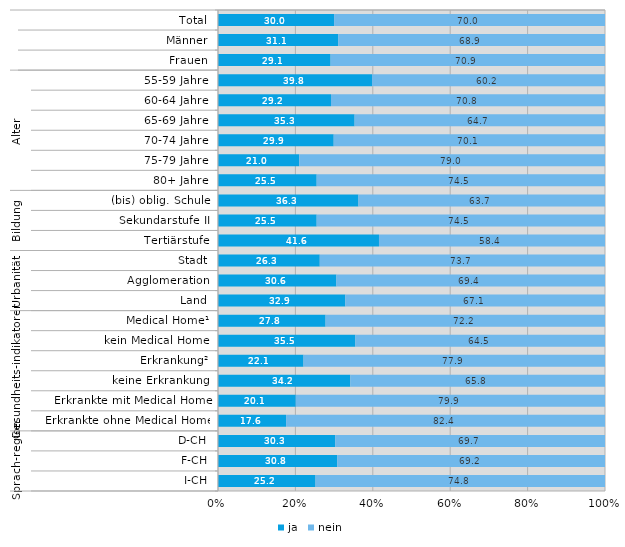
| Category | ja | nein |
|---|---|---|
| 0 | 30 | 70 |
| 1 | 31.1 | 68.9 |
| 2 | 29.1 | 70.9 |
| 3 | 39.8 | 60.2 |
| 4 | 29.2 | 70.8 |
| 5 | 35.3 | 64.7 |
| 6 | 29.9 | 70.1 |
| 7 | 21 | 79 |
| 8 | 25.5 | 74.5 |
| 9 | 36.3 | 63.7 |
| 10 | 25.5 | 74.5 |
| 11 | 41.6 | 58.4 |
| 12 | 26.3 | 73.7 |
| 13 | 30.6 | 69.4 |
| 14 | 32.9 | 67.1 |
| 15 | 27.8 | 72.2 |
| 16 | 35.5 | 64.5 |
| 17 | 22.1 | 77.9 |
| 18 | 34.2 | 65.8 |
| 19 | 20.1 | 79.9 |
| 20 | 17.6 | 82.4 |
| 21 | 30.3 | 69.7 |
| 22 | 30.8 | 69.2 |
| 23 | 25.2 | 74.8 |